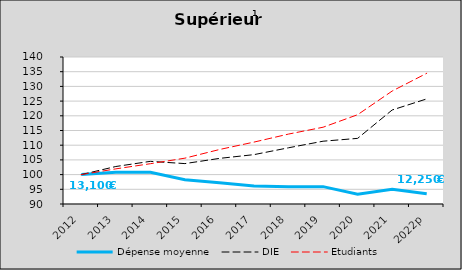
| Category | Dépense moyenne  | DIE  | Etudiants |
|---|---|---|---|
| 2012 | 100 | 100 | 100 |
| 2013 | 100.789 | 102.753 | 101.949 |
| 2014 | 100.774 | 104.507 | 103.704 |
| 2015 | 98.246 | 103.74 | 105.592 |
| 2016 | 97.22 | 105.512 | 108.529 |
| 2017 | 96.158 | 106.79 | 111.057 |
| 2018 | 95.904 | 109.124 | 113.785 |
| 2019 | 95.905 | 111.358 | 116.113 |
| 2020 | 93.311 | 112.325 | 120.378 |
| 2021 | 94.985 | 121.981 | 128.422 |
| 2022p | 93.519 | 125.746 | 134.46 |